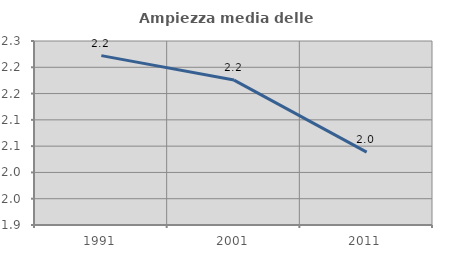
| Category | Ampiezza media delle famiglie |
|---|---|
| 1991.0 | 2.222 |
| 2001.0 | 2.176 |
| 2011.0 | 2.039 |